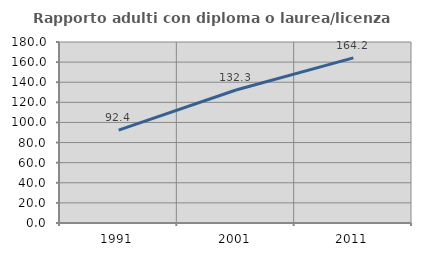
| Category | Rapporto adulti con diploma o laurea/licenza media  |
|---|---|
| 1991.0 | 92.424 |
| 2001.0 | 132.273 |
| 2011.0 | 164.245 |